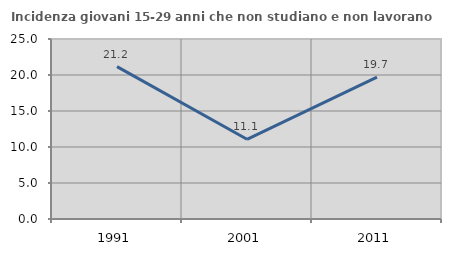
| Category | Incidenza giovani 15-29 anni che non studiano e non lavorano  |
|---|---|
| 1991.0 | 21.169 |
| 2001.0 | 11.07 |
| 2011.0 | 19.709 |